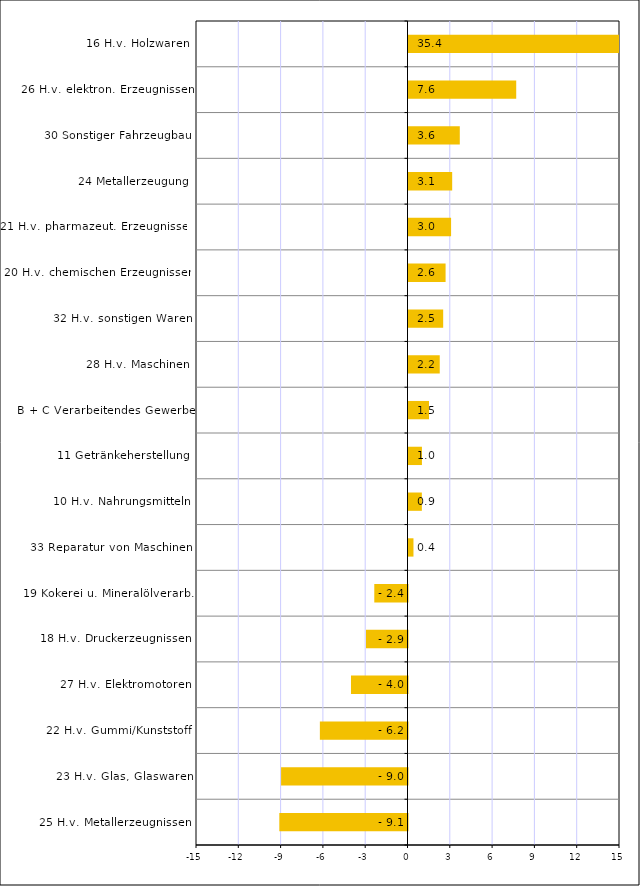
| Category | Series 0 |
|---|---|
| 25 H.v. Metallerzeugnissen | -9.091 |
| 23 H.v. Glas, Glaswaren | -8.966 |
| 22 H.v. Gummi/Kunststoff | -6.215 |
| 27 H.v. Elektromotoren | -4.008 |
| 18 H.v. Druckerzeugnissen | -2.943 |
| 19 Kokerei u. Mineralölverarb. | -2.356 |
| 33 Reparatur von Maschinen | 0.352 |
| 10 H.v. Nahrungsmitteln | 0.947 |
| 11 Getränkeherstellung | 0.952 |
| B + C Verarbeitendes Gewerbe | 1.454 |
| 28 H.v. Maschinen | 2.216 |
| 32 H.v. sonstigen Waren | 2.46 |
| 20 H.v. chemischen Erzeugnissen | 2.63 |
| 21 H.v. pharmazeut. Erzeugnissen | 3.02 |
| 24 Metallerzeugung | 3.098 |
| 30 Sonstiger Fahrzeugbau | 3.638 |
| 26 H.v. elektron. Erzeugnissen | 7.64 |
| 16 H.v. Holzwaren | 35.385 |